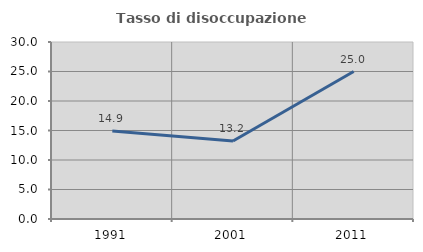
| Category | Tasso di disoccupazione giovanile  |
|---|---|
| 1991.0 | 14.933 |
| 2001.0 | 13.216 |
| 2011.0 | 25 |